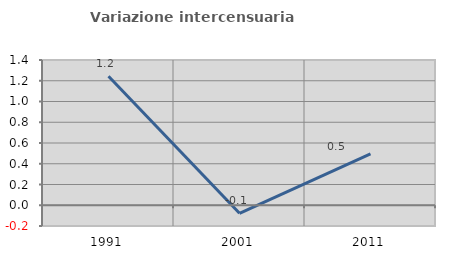
| Category | Variazione intercensuaria annua |
|---|---|
| 1991.0 | 1.243 |
| 2001.0 | -0.078 |
| 2011.0 | 0.496 |